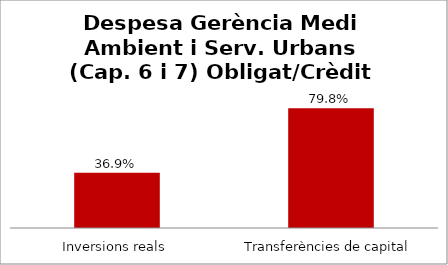
| Category | Series 0 |
|---|---|
| Inversions reals | 0.369 |
| Transferències de capital | 0.798 |